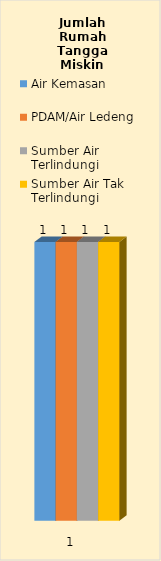
| Category | Air Kemasan | PDAM/Air Ledeng | Sumber Air Terlindungi | Sumber Air Tak Terlindungi |
|---|---|---|---|---|
| 0 | 1 | 1 | 1 | 1 |